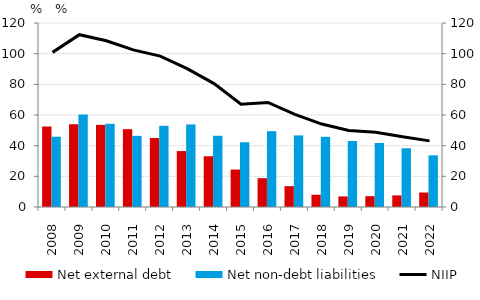
| Category | Net external debt | Net non-debt liabilities |
|---|---|---|
| 2008.0 | 52.496 | 45.849 |
| 2009.0 | 53.975 | 60.318 |
| 2010.0 | 53.56 | 54.245 |
| 2011.0 | 50.774 | 46.406 |
| 2012.0 | 45.011 | 52.933 |
| 2013.0 | 36.475 | 53.831 |
| 2014.0 | 33.104 | 46.457 |
| 2015.0 | 24.432 | 42.223 |
| 2016.0 | 18.793 | 49.456 |
| 2017.0 | 13.599 | 46.702 |
| 2018.0 | 7.995 | 45.773 |
| 2019.0 | 6.893 | 43.046 |
| 2020.0 | 7.071 | 41.732 |
| 2021.0 | 7.559 | 38.275 |
| 2022.0 | 9.447 | 33.674 |